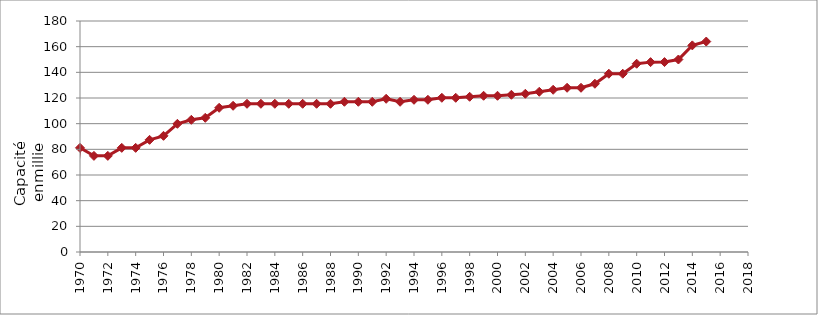
| Category | Capacité moyenne des méthaniers (millier de m3) |
|---|---|
| 1965.0 | 0 |
| 1966.0 | 0 |
| 1967.0 | 0 |
| 1968.0 | 0 |
| 1969.0 | 0 |
| 1970.0 | 81.153 |
| 1971.0 | 74.911 |
| 1972.0 | 74.911 |
| 1973.0 | 81.153 |
| 1974.0 | 81.153 |
| 1975.0 | 87.396 |
| 1976.0 | 90.517 |
| 1977.0 | 99.881 |
| 1978.0 | 103.002 |
| 1979.0 | 104.563 |
| 1980.0 | 112.366 |
| 1981.0 | 113.927 |
| 1982.0 | 115.487 |
| 1983.0 | 115.487 |
| 1984.0 | 115.487 |
| 1985.0 | 115.487 |
| 1986.0 | 115.487 |
| 1987.0 | 115.487 |
| 1988.0 | 115.487 |
| 1989.0 | 117.048 |
| 1990.0 | 117.048 |
| 1991.0 | 117.048 |
| 1992.0 | 119.389 |
| 1993.0 | 117.048 |
| 1994.0 | 118.609 |
| 1995.0 | 118.609 |
| 1996.0 | 120.169 |
| 1997.0 | 120.169 |
| 1998.0 | 120.949 |
| 1999.0 | 121.73 |
| 2000.0 | 121.73 |
| 2001.0 | 122.51 |
| 2002.0 | 123.29 |
| 2003.0 | 124.851 |
| 2004.0 | 126.412 |
| 2005.0 | 127.972 |
| 2006.0 | 127.972 |
| 2007.0 | 131.094 |
| 2008.0 | 138.897 |
| 2009.0 | 138.897 |
| 2010.0 | 146.7 |
| 2011.0 | 147.951 |
| 2012.0 | 148 |
| 2013.0 | 150 |
| 2014.0 | 161 |
| 2015.0 | 164 |